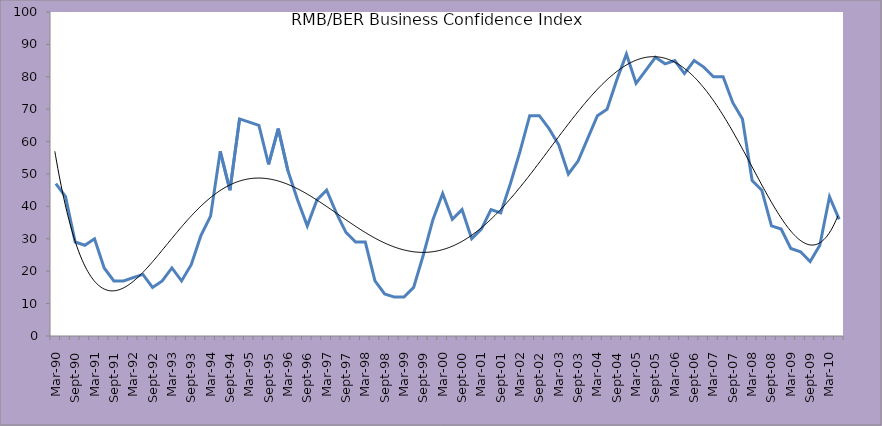
| Category | RMB/BER Business Confidence Index |
|---|---|
| Mar-90 | 47 |
| Jun-90 | 43 |
| Sep-90 | 29 |
| Dec-90 | 28 |
| Mar-91 | 30 |
| Jun-91 | 21 |
| Sep-91 | 17 |
| Dec-91 | 17 |
| Mar-92 | 18 |
| Jun-92 | 19 |
| Sep-92 | 15 |
| Dec-92 | 17 |
| Mar-93 | 21 |
| Jun-93 | 17 |
| Sep-93 | 22 |
| Dec-93 | 31 |
| Mar-94 | 37 |
| Jun-94 | 57 |
| Sep-94 | 45 |
| Dec-94 | 67 |
| Mar-95 | 66 |
| Jun-95 | 65 |
| Sep-95 | 53 |
| Dec-95 | 64 |
| Mar-96 | 51 |
| Jun-96 | 42 |
| Sep-96 | 34 |
| Dec-96 | 42 |
| Mar-97 | 45 |
| Jun-97 | 38 |
| Sep-97 | 32 |
| Dec-97 | 29 |
| Mar-98 | 29 |
| Jun-98 | 17 |
| Sep-98 | 13 |
| Dec-98 | 12 |
| Mar-99 | 12 |
| Jun-99 | 15 |
| Sep-99 | 25 |
| Dec-99 | 36 |
| Mar-00 | 44 |
| Jun-00 | 36 |
| Sep-00 | 39 |
| Dec-00 | 30 |
| Mar-01 | 33 |
| Jun-01 | 39 |
| Sep-01 | 38 |
| Dec-01 | 47 |
| Mar-02 | 57 |
| Jun-02 | 68 |
| Sep-02 | 68 |
| Dec-02 | 64 |
| Mar-03 | 59 |
| Jun-03 | 50 |
| Sep-03 | 54 |
| Dec-03 | 61 |
| Mar-04 | 68 |
| Jun-04 | 70 |
| Sep-04 | 79 |
| Dec-04 | 87 |
| Mar-05 | 78 |
| Jun-05 | 82 |
| Sep-05 | 86 |
| Dec-05 | 84 |
| Mar-06 | 85 |
| Jun-06 | 81 |
| Sep-06 | 85 |
| Dec-06 | 83 |
| Mar-07 | 80 |
| Jun-07 | 80 |
| Sep-07 | 72 |
| Dec-07 | 67 |
| Mar-08 | 48 |
| Jun-08 | 45 |
| Sep-08 | 34 |
| Dec-08 | 33 |
| Mar-09 | 27 |
| Jun-09 | 26 |
| Sep-09 | 23 |
| Dec-09 | 28 |
| Mar-10 | 43 |
| Jun-10 | 36 |